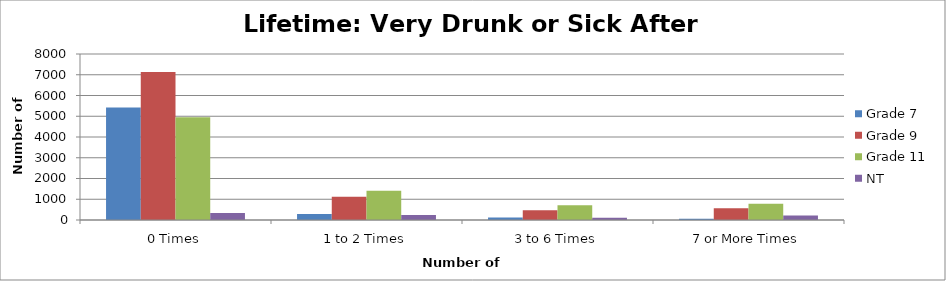
| Category | Grade 7 | Grade 9 | Grade 11 | NT |
|---|---|---|---|---|
| 0 Times | 5421.56 | 7128.04 | 4949.91 | 339.34 |
| 1 to 2 Times | 294.65 | 1125.48 | 1414.26 | 241.11 |
| 3 to 6 Times | 117.86 | 468.95 | 707.13 | 107.16 |
| 7 or More Times | 58.93 | 562.74 | 785.7 | 214.32 |